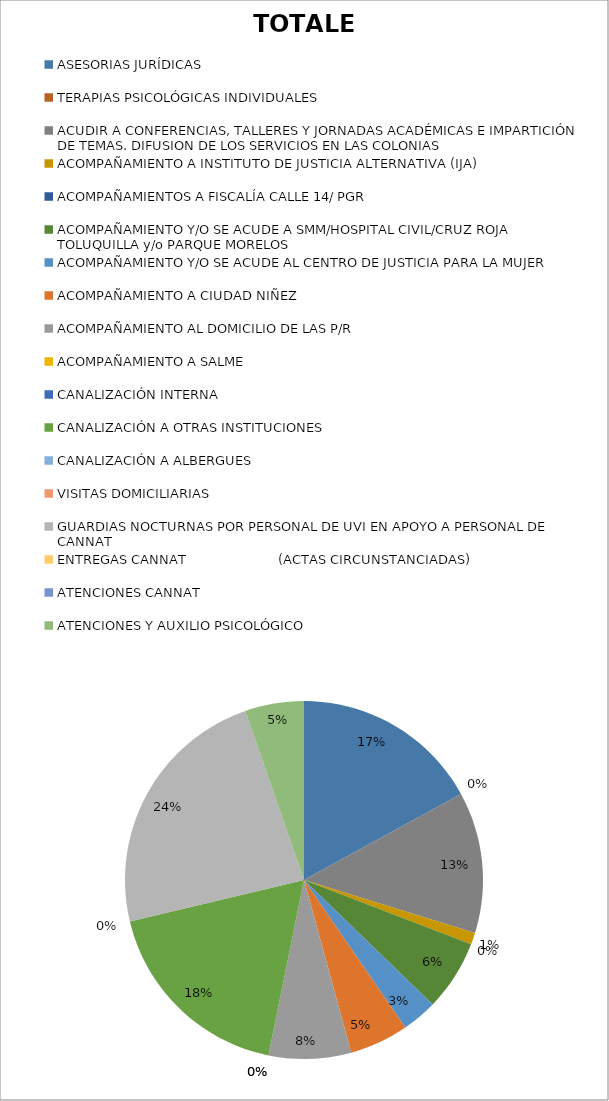
| Category | TOTALES |
|---|---|
| ASESORIAS JURÍDICAS | 16 |
| TERAPIAS PSICOLÓGICAS INDIVIDUALES | 0 |
| ACUDIR A CONFERENCIAS, TALLERES Y JORNADAS ACADÉMICAS E IMPARTICIÓN DE TEMAS. DIFUSION DE LOS SERVICIOS EN LAS COLONIAS | 12 |
| ACOMPAÑAMIENTO A INSTITUTO DE JUSTICIA ALTERNATIVA (IJA) | 1 |
| ACOMPAÑAMIENTOS A FISCALÍA CALLE 14/ PGR | 0 |
| ACOMPAÑAMIENTO Y/O SE ACUDE A SMM/HOSPITAL CIVIL/CRUZ ROJA TOLUQUILLA y/o PARQUE MORELOS | 6 |
| ACOMPAÑAMIENTO Y/O SE ACUDE AL CENTRO DE JUSTICIA PARA LA MUJER | 3 |
| ACOMPAÑAMIENTO A CIUDAD NIÑEZ  | 5 |
| ACOMPAÑAMIENTO AL DOMICILIO DE LAS P/R | 7 |
| ACOMPAÑAMIENTO A SALME | 0 |
| CANALIZACIÓN INTERNA | 0 |
| CANALIZACIÓN A OTRAS INSTITUCIONES | 17 |
| CANALIZACIÓN A ALBERGUES | 0 |
| VISITAS DOMICILIARIAS  | 0 |
| GUARDIAS NOCTURNAS POR PERSONAL DE UVI EN APOYO A PERSONAL DE CANNAT | 22 |
| ENTREGAS CANNAT                       (ACTAS CIRCUNSTANCIADAS) | 0 |
| ATENCIONES CANNAT | 0 |
| ATENCIONES Y AUXILIO PSICOLÓGICO | 5 |